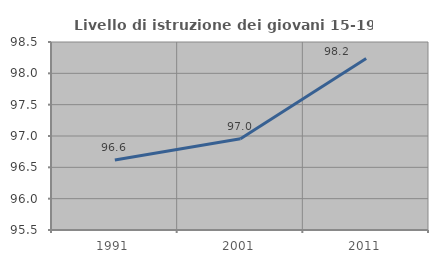
| Category | Livello di istruzione dei giovani 15-19 anni |
|---|---|
| 1991.0 | 96.616 |
| 2001.0 | 96.958 |
| 2011.0 | 98.235 |